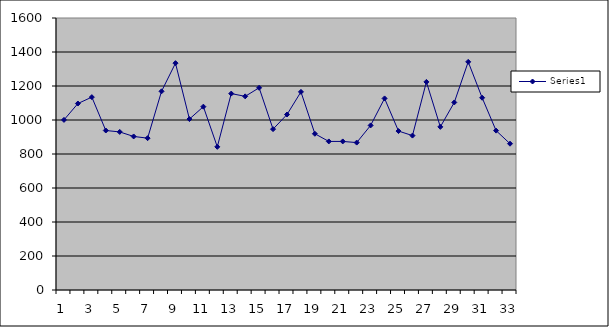
| Category | Series 0 |
|---|---|
| 0 | 1000.618 |
| 1 | 1096.885 |
| 2 | 1134.507 |
| 3 | 938.271 |
| 4 | 929.819 |
| 5 | 903.125 |
| 6 | 893.109 |
| 7 | 1168.799 |
| 8 | 1334.362 |
| 9 | 1005.481 |
| 10 | 1078.444 |
| 11 | 842.274 |
| 12 | 1155.379 |
| 13 | 1139.124 |
| 14 | 1189.361 |
| 15 | 946.233 |
| 16 | 1032.205 |
| 17 | 1165.432 |
| 18 | 919.076 |
| 19 | 873.958 |
| 20 | 873.923 |
| 21 | 867.161 |
| 22 | 968.263 |
| 23 | 1126.893 |
| 24 | 934.988 |
| 25 | 908.3 |
| 26 | 1224.119 |
| 27 | 959.594 |
| 28 | 1103.195 |
| 29 | 1342.069 |
| 30 | 1130.824 |
| 31 | 937.531 |
| 32 | 860.562 |